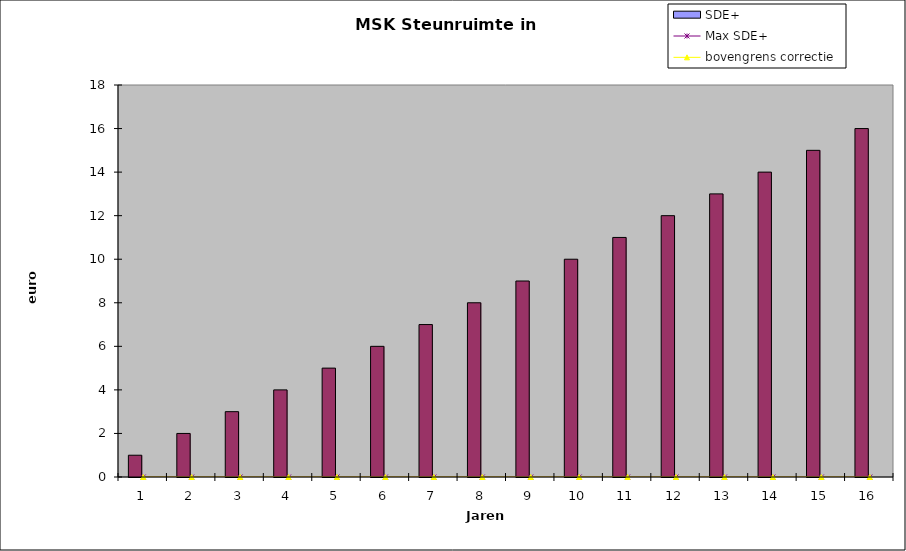
| Category | jaar | SDE+ |
|---|---|---|
| 0 | 1 | 0 |
| 1 | 2 | 0 |
| 2 | 3 | 0 |
| 3 | 4 | 0 |
| 4 | 5 | 0 |
| 5 | 6 | 0 |
| 6 | 7 | 0 |
| 7 | 8 | 0 |
| 8 | 9 | 0 |
| 9 | 10 | 0 |
| 10 | 11 | 0 |
| 11 | 12 | 0 |
| 12 | 13 | 0 |
| 13 | 14 | 0 |
| 14 | 15 | 0 |
| 15 | 16 | 0 |